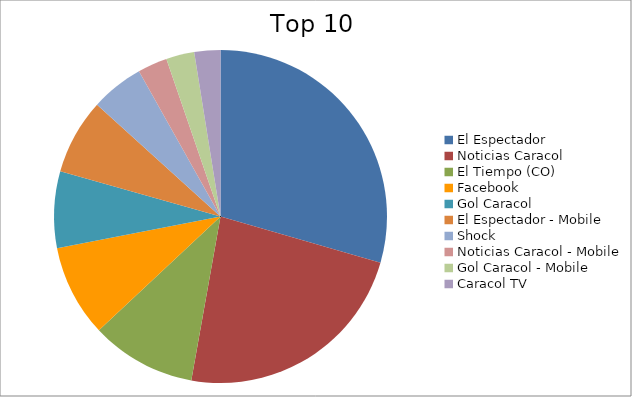
| Category | Series 0 |
|---|---|
| El Espectador | 22.83 |
| Noticias Caracol | 18.08 |
| El Tiempo (CO) | 7.92 |
| Facebook | 6.91 |
| Gol Caracol | 5.76 |
| El Espectador - Mobile | 5.67 |
| Shock | 3.99 |
| Noticias Caracol - Mobile | 2.23 |
| Gol Caracol - Mobile | 2.12 |
| Caracol TV | 1.96 |